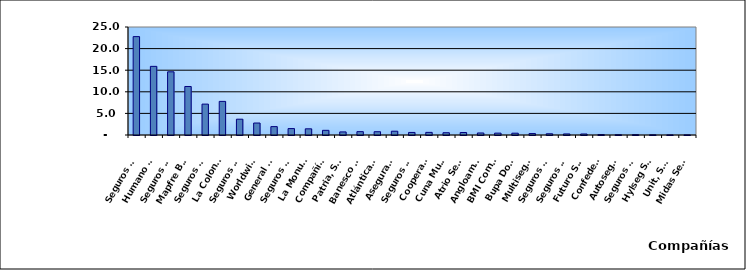
| Category | Series 0 |
|---|---|
| Seguros Universal, S. A. | 22.772 |
| Humano Seguros, S. A. | 15.889 |
| Seguros Reservas, S. A. | 14.63 |
| Mapfre BHD Compañía de Seguros | 11.23 |
| Seguros Sura, S.A. | 7.149 |
| La Colonial, S. A., Compañia De Seguros | 7.783 |
| Seguros Crecer, S. A. | 3.659 |
| Worldwide Seguros, S. A. | 2.773 |
| General de Seguros, S. A. | 1.939 |
| Seguros Pepín, S. A. | 1.484 |
| La Monumental de Seguros, S. A. | 1.43 |
| Compañía Dominicana de Seguros, C. por A. | 1.081 |
| Patria, S. A., Compañía de Seguros | 0.715 |
| Banesco Seguros | 0.776 |
| Atlántica Seguros, S. A. | 0.757 |
| Aseguradora Agropecuaria Dominicana, S. A. | 0.876 |
| Seguros La Internacional, S. A. | 0.591 |
| Cooperativa Nacional De Seguros, Inc  | 0.605 |
| Cuna Mutual Insurance Society Dominicana | 0.526 |
| Atrio Seguros S. A. | 0.578 |
| Angloamericana de Seguros, S. A. | 0.469 |
| BMI Compañía de Seguros, S. A. | 0.433 |
| Bupa Dominicana, S. A. | 0.419 |
| Multiseguros Su, S.A. | 0.334 |
| Seguros APS, S.R.L. | 0.285 |
| Seguros Ademi, S.A. | 0.248 |
| Futuro Seguros | 0.232 |
| Confederación del Canadá Dominicana, S. A. | 0.103 |
| Autoseguro, S. A. | 0.065 |
| Seguros Yunen, S.A. | 0.079 |
| Hylseg Seguros S.A | 0.046 |
| Unit, S.A. | 0.025 |
| Midas Seguros, S.A. | 0.022 |